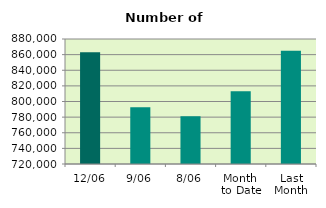
| Category | Series 0 |
|---|---|
| 12/06 | 863156 |
| 9/06 | 792522 |
| 8/06 | 781252 |
| Month 
to Date | 813081.5 |
| Last
Month | 864947.182 |